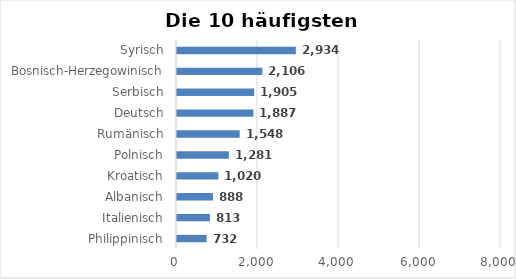
| Category | Series 0 |
|---|---|
| Philippinisch | 732 |
| Italienisch | 813 |
| Albanisch | 888 |
| Kroatisch | 1020 |
| Polnisch | 1281 |
| Rumänisch | 1548 |
| Deutsch | 1887 |
| Serbisch | 1905 |
| Bosnisch-Herzegowinisch | 2106 |
| Syrisch | 2934 |